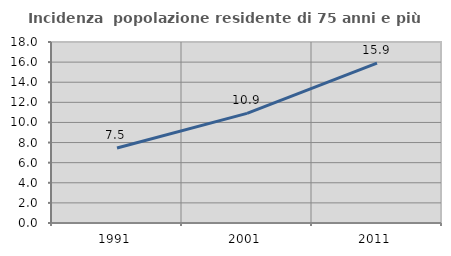
| Category | Incidenza  popolazione residente di 75 anni e più |
|---|---|
| 1991.0 | 7.465 |
| 2001.0 | 10.898 |
| 2011.0 | 15.891 |